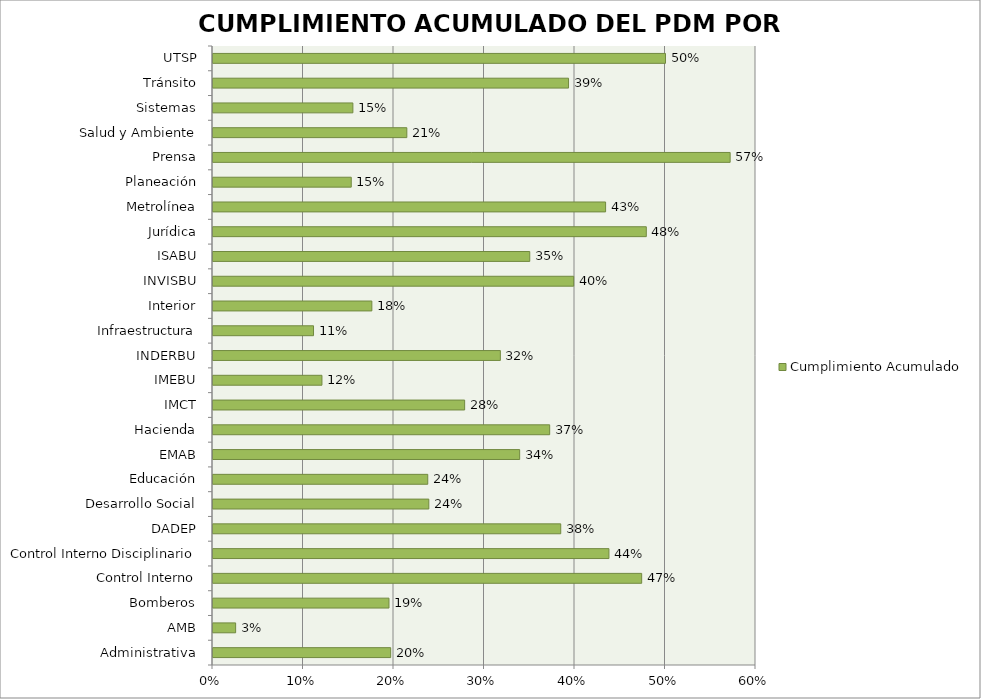
| Category | Cumplimiento Acumulado |
|---|---|
| Administrativa | 0.196 |
| AMB | 0.025 |
| Bomberos | 0.194 |
| Control Interno | 0.474 |
| Control Interno Disciplinario | 0.438 |
| DADEP | 0.384 |
| Desarrollo Social | 0.238 |
| Educación | 0.237 |
| EMAB | 0.339 |
| Hacienda | 0.372 |
| IMCT | 0.278 |
| IMEBU | 0.12 |
| INDERBU | 0.318 |
| Infraestructura | 0.111 |
| Interior | 0.176 |
| INVISBU | 0.399 |
| ISABU | 0.35 |
| Jurídica | 0.479 |
| Metrolínea | 0.434 |
| Planeación | 0.153 |
| Prensa | 0.571 |
| Salud y Ambiente | 0.214 |
| Sistemas | 0.155 |
| Tránsito | 0.393 |
| UTSP | 0.5 |